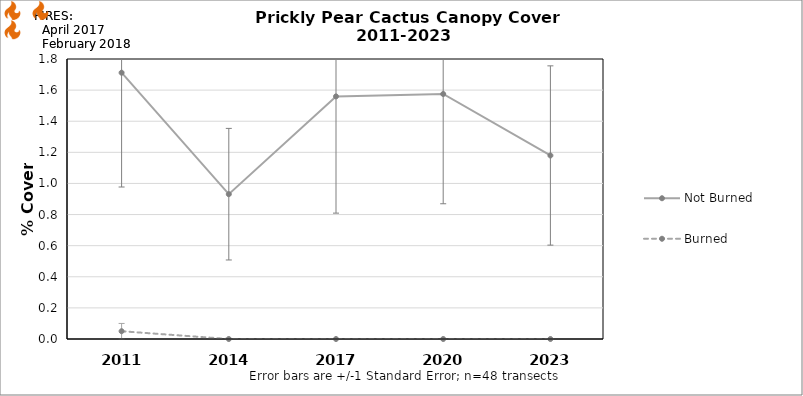
| Category | Not Burned | Burned |
|---|---|---|
| 2011.0 | 1.712 | 0.05 |
| 2014.0 | 0.931 | 0 |
| 2017.0 | 1.56 | 0 |
| 2020.0 | 1.575 | 0 |
| 2023.0 | 1.18 | 0 |